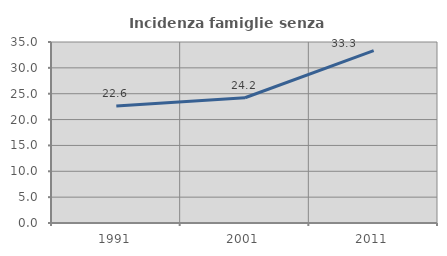
| Category | Incidenza famiglie senza nuclei |
|---|---|
| 1991.0 | 22.621 |
| 2001.0 | 24.214 |
| 2011.0 | 33.333 |